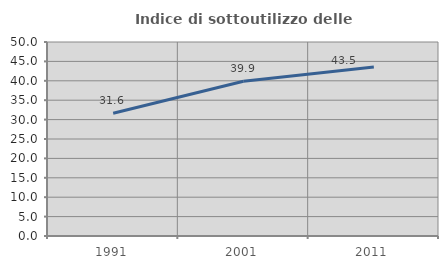
| Category | Indice di sottoutilizzo delle abitazioni  |
|---|---|
| 1991.0 | 31.638 |
| 2001.0 | 39.863 |
| 2011.0 | 43.538 |